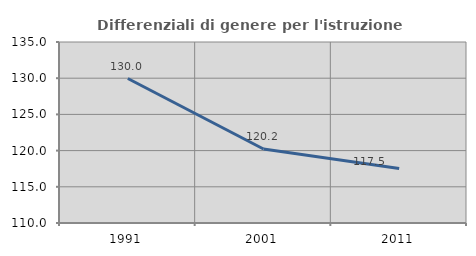
| Category | Differenziali di genere per l'istruzione superiore |
|---|---|
| 1991.0 | 129.954 |
| 2001.0 | 120.217 |
| 2011.0 | 117.534 |